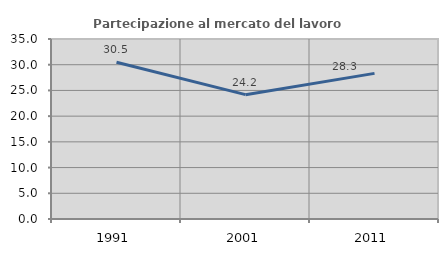
| Category | Partecipazione al mercato del lavoro  femminile |
|---|---|
| 1991.0 | 30.488 |
| 2001.0 | 24.179 |
| 2011.0 | 28.319 |